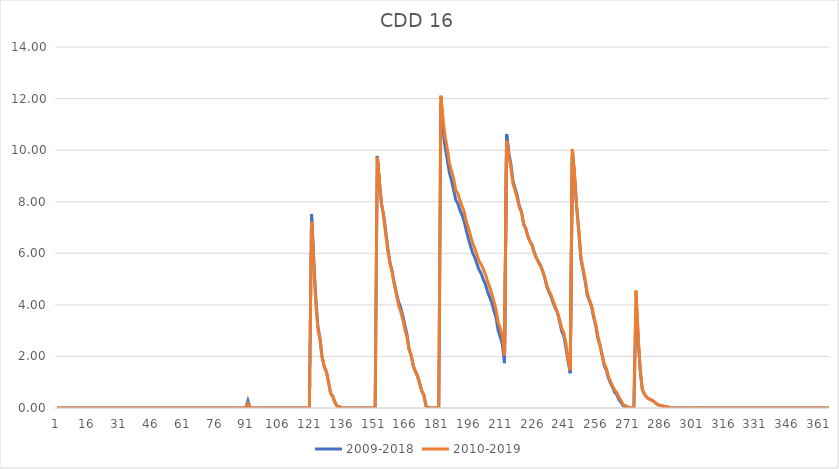
| Category | 2009-2018 | 2010-2019 |
|---|---|---|
| 0 | 0 | 0 |
| 1 | 0 | 0 |
| 2 | 0 | 0 |
| 3 | 0 | 0 |
| 4 | 0 | 0 |
| 5 | 0 | 0 |
| 6 | 0 | 0 |
| 7 | 0 | 0 |
| 8 | 0 | 0 |
| 9 | 0 | 0 |
| 10 | 0 | 0 |
| 11 | 0 | 0 |
| 12 | 0 | 0 |
| 13 | 0 | 0 |
| 14 | 0 | 0 |
| 15 | 0 | 0 |
| 16 | 0 | 0 |
| 17 | 0 | 0 |
| 18 | 0 | 0 |
| 19 | 0 | 0 |
| 20 | 0 | 0 |
| 21 | 0 | 0 |
| 22 | 0 | 0 |
| 23 | 0 | 0 |
| 24 | 0 | 0 |
| 25 | 0 | 0 |
| 26 | 0 | 0 |
| 27 | 0 | 0 |
| 28 | 0 | 0 |
| 29 | 0 | 0 |
| 30 | 0 | 0 |
| 31 | 0 | 0 |
| 32 | 0 | 0 |
| 33 | 0 | 0 |
| 34 | 0 | 0 |
| 35 | 0 | 0 |
| 36 | 0 | 0 |
| 37 | 0 | 0 |
| 38 | 0 | 0 |
| 39 | 0 | 0 |
| 40 | 0 | 0 |
| 41 | 0 | 0 |
| 42 | 0 | 0 |
| 43 | 0 | 0 |
| 44 | 0 | 0 |
| 45 | 0 | 0 |
| 46 | 0 | 0 |
| 47 | 0 | 0 |
| 48 | 0 | 0 |
| 49 | 0 | 0 |
| 50 | 0 | 0 |
| 51 | 0 | 0 |
| 52 | 0 | 0 |
| 53 | 0 | 0 |
| 54 | 0 | 0 |
| 55 | 0 | 0 |
| 56 | 0 | 0 |
| 57 | 0 | 0 |
| 58 | 0 | 0 |
| 59 | 0 | 0 |
| 60 | 0 | 0 |
| 61 | 0 | 0 |
| 62 | 0 | 0 |
| 63 | 0 | 0 |
| 64 | 0 | 0 |
| 65 | 0 | 0 |
| 66 | 0 | 0 |
| 67 | 0 | 0 |
| 68 | 0 | 0 |
| 69 | 0 | 0 |
| 70 | 0 | 0 |
| 71 | 0 | 0 |
| 72 | 0 | 0 |
| 73 | 0 | 0 |
| 74 | 0 | 0 |
| 75 | 0 | 0 |
| 76 | 0 | 0 |
| 77 | 0 | 0 |
| 78 | 0 | 0 |
| 79 | 0 | 0 |
| 80 | 0 | 0 |
| 81 | 0 | 0 |
| 82 | 0 | 0 |
| 83 | 0 | 0 |
| 84 | 0 | 0 |
| 85 | 0 | 0 |
| 86 | 0 | 0 |
| 87 | 0 | 0 |
| 88 | 0 | 0 |
| 89 | 0 | 0 |
| 90 | 0.28 | 0.17 |
| 91 | 0 | 0 |
| 92 | 0 | 0 |
| 93 | 0 | 0 |
| 94 | 0 | 0 |
| 95 | 0 | 0 |
| 96 | 0 | 0 |
| 97 | 0 | 0 |
| 98 | 0 | 0 |
| 99 | 0 | 0 |
| 100 | 0 | 0 |
| 101 | 0 | 0 |
| 102 | 0 | 0 |
| 103 | 0 | 0 |
| 104 | 0 | 0 |
| 105 | 0 | 0 |
| 106 | 0 | 0 |
| 107 | 0 | 0 |
| 108 | 0 | 0 |
| 109 | 0 | 0 |
| 110 | 0 | 0 |
| 111 | 0 | 0 |
| 112 | 0 | 0 |
| 113 | 0 | 0 |
| 114 | 0 | 0 |
| 115 | 0 | 0 |
| 116 | 0 | 0 |
| 117 | 0 | 0 |
| 118 | 0 | 0 |
| 119 | 0 | 0 |
| 120 | 7.51 | 7.22 |
| 121 | 5.83 | 5.63 |
| 122 | 4.29 | 4.1 |
| 123 | 3.17 | 3.07 |
| 124 | 2.69 | 2.66 |
| 125 | 1.96 | 1.96 |
| 126 | 1.61 | 1.61 |
| 127 | 1.41 | 1.41 |
| 128 | 1.02 | 1.02 |
| 129 | 0.58 | 0.58 |
| 130 | 0.45 | 0.45 |
| 131 | 0.23 | 0.23 |
| 132 | 0.08 | 0.08 |
| 133 | 0.06 | 0.06 |
| 134 | 0 | 0 |
| 135 | 0 | 0 |
| 136 | 0 | 0 |
| 137 | 0 | 0 |
| 138 | 0 | 0 |
| 139 | 0 | 0 |
| 140 | 0 | 0 |
| 141 | 0 | 0 |
| 142 | 0 | 0 |
| 143 | 0 | 0 |
| 144 | 0 | 0 |
| 145 | 0 | 0 |
| 146 | 0 | 0 |
| 147 | 0 | 0 |
| 148 | 0 | 0 |
| 149 | 0 | 0 |
| 150 | 0 | 0 |
| 151 | 9.77 | 9.73 |
| 152 | 8.76 | 8.8 |
| 153 | 7.9 | 7.94 |
| 154 | 7.48 | 7.43 |
| 155 | 6.86 | 6.73 |
| 156 | 6.19 | 6.08 |
| 157 | 5.63 | 5.61 |
| 158 | 5.32 | 5.27 |
| 159 | 4.86 | 4.78 |
| 160 | 4.5 | 4.42 |
| 161 | 4.13 | 3.98 |
| 162 | 3.91 | 3.76 |
| 163 | 3.58 | 3.44 |
| 164 | 3.21 | 3.06 |
| 165 | 2.87 | 2.74 |
| 166 | 2.27 | 2.27 |
| 167 | 2.04 | 2.06 |
| 168 | 1.63 | 1.64 |
| 169 | 1.41 | 1.42 |
| 170 | 1.24 | 1.24 |
| 171 | 0.95 | 0.95 |
| 172 | 0.65 | 0.65 |
| 173 | 0.49 | 0.49 |
| 174 | 0.08 | 0.08 |
| 175 | 0.01 | 0.01 |
| 176 | 0 | 0 |
| 177 | 0 | 0 |
| 178 | 0 | 0 |
| 179 | 0 | 0 |
| 180 | 0 | 0 |
| 181 | 11.82 | 12.11 |
| 182 | 10.8 | 11.17 |
| 183 | 10.09 | 10.53 |
| 184 | 9.66 | 10.07 |
| 185 | 9.13 | 9.52 |
| 186 | 8.82 | 9.19 |
| 187 | 8.47 | 8.9 |
| 188 | 8.07 | 8.45 |
| 189 | 7.93 | 8.32 |
| 190 | 7.67 | 8.06 |
| 191 | 7.48 | 7.82 |
| 192 | 7.23 | 7.6 |
| 193 | 6.88 | 7.22 |
| 194 | 6.56 | 6.98 |
| 195 | 6.27 | 6.67 |
| 196 | 6.01 | 6.38 |
| 197 | 5.83 | 6.19 |
| 198 | 5.59 | 5.94 |
| 199 | 5.36 | 5.7 |
| 200 | 5.22 | 5.57 |
| 201 | 4.99 | 5.39 |
| 202 | 4.8 | 5.2 |
| 203 | 4.52 | 4.92 |
| 204 | 4.3 | 4.7 |
| 205 | 4.08 | 4.43 |
| 206 | 3.78 | 4.14 |
| 207 | 3.52 | 3.82 |
| 208 | 3.01 | 3.34 |
| 209 | 2.75 | 3.08 |
| 210 | 2.48 | 2.83 |
| 211 | 1.74 | 2.04 |
| 212 | 10.62 | 10.36 |
| 213 | 9.9 | 9.77 |
| 214 | 9.48 | 9.33 |
| 215 | 8.81 | 8.69 |
| 216 | 8.52 | 8.43 |
| 217 | 8.24 | 8.14 |
| 218 | 7.83 | 7.77 |
| 219 | 7.62 | 7.61 |
| 220 | 7.12 | 7.17 |
| 221 | 6.98 | 6.93 |
| 222 | 6.67 | 6.66 |
| 223 | 6.46 | 6.47 |
| 224 | 6.33 | 6.3 |
| 225 | 6.04 | 6.01 |
| 226 | 5.83 | 5.82 |
| 227 | 5.68 | 5.65 |
| 228 | 5.53 | 5.5 |
| 229 | 5.32 | 5.29 |
| 230 | 5.04 | 5.08 |
| 231 | 4.69 | 4.75 |
| 232 | 4.49 | 4.54 |
| 233 | 4.31 | 4.38 |
| 234 | 4.07 | 4.14 |
| 235 | 3.86 | 3.92 |
| 236 | 3.69 | 3.71 |
| 237 | 3.35 | 3.4 |
| 238 | 2.97 | 3.09 |
| 239 | 2.79 | 2.91 |
| 240 | 2.33 | 2.49 |
| 241 | 1.81 | 1.87 |
| 242 | 1.35 | 1.46 |
| 243 | 9.77 | 10.04 |
| 244 | 9.06 | 9.08 |
| 245 | 7.82 | 7.84 |
| 246 | 6.91 | 6.93 |
| 247 | 5.8 | 5.87 |
| 248 | 5.36 | 5.43 |
| 249 | 4.94 | 5.02 |
| 250 | 4.38 | 4.48 |
| 251 | 4.16 | 4.21 |
| 252 | 3.95 | 4 |
| 253 | 3.53 | 3.61 |
| 254 | 3.2 | 3.26 |
| 255 | 2.72 | 2.79 |
| 256 | 2.45 | 2.45 |
| 257 | 2.08 | 2.06 |
| 258 | 1.65 | 1.71 |
| 259 | 1.47 | 1.55 |
| 260 | 1.16 | 1.21 |
| 261 | 0.97 | 1.03 |
| 262 | 0.81 | 0.84 |
| 263 | 0.6 | 0.69 |
| 264 | 0.51 | 0.6 |
| 265 | 0.32 | 0.41 |
| 266 | 0.21 | 0.29 |
| 267 | 0.08 | 0.12 |
| 268 | 0.07 | 0.09 |
| 269 | 0.04 | 0.04 |
| 270 | 0 | 0 |
| 271 | 0 | 0 |
| 272 | 0 | 0 |
| 273 | 3.86 | 4.55 |
| 274 | 2.7 | 2.84 |
| 275 | 1.46 | 1.47 |
| 276 | 0.72 | 0.72 |
| 277 | 0.54 | 0.54 |
| 278 | 0.42 | 0.42 |
| 279 | 0.36 | 0.36 |
| 280 | 0.32 | 0.32 |
| 281 | 0.28 | 0.28 |
| 282 | 0.21 | 0.21 |
| 283 | 0.15 | 0.15 |
| 284 | 0.11 | 0.11 |
| 285 | 0.09 | 0.09 |
| 286 | 0.07 | 0.07 |
| 287 | 0.05 | 0.05 |
| 288 | 0.04 | 0.04 |
| 289 | 0 | 0 |
| 290 | 0 | 0 |
| 291 | 0 | 0 |
| 292 | 0 | 0 |
| 293 | 0 | 0 |
| 294 | 0 | 0 |
| 295 | 0 | 0 |
| 296 | 0 | 0 |
| 297 | 0 | 0 |
| 298 | 0 | 0 |
| 299 | 0 | 0 |
| 300 | 0 | 0 |
| 301 | 0 | 0 |
| 302 | 0 | 0 |
| 303 | 0 | 0 |
| 304 | 0.01 | 0.01 |
| 305 | 0 | 0 |
| 306 | 0 | 0 |
| 307 | 0 | 0 |
| 308 | 0 | 0 |
| 309 | 0 | 0 |
| 310 | 0 | 0 |
| 311 | 0 | 0 |
| 312 | 0 | 0 |
| 313 | 0 | 0 |
| 314 | 0 | 0 |
| 315 | 0 | 0 |
| 316 | 0 | 0 |
| 317 | 0 | 0 |
| 318 | 0 | 0 |
| 319 | 0 | 0 |
| 320 | 0 | 0 |
| 321 | 0 | 0 |
| 322 | 0 | 0 |
| 323 | 0 | 0 |
| 324 | 0 | 0 |
| 325 | 0 | 0 |
| 326 | 0 | 0 |
| 327 | 0 | 0 |
| 328 | 0 | 0 |
| 329 | 0 | 0 |
| 330 | 0 | 0 |
| 331 | 0 | 0 |
| 332 | 0 | 0 |
| 333 | 0 | 0 |
| 334 | 0 | 0 |
| 335 | 0 | 0 |
| 336 | 0 | 0 |
| 337 | 0 | 0 |
| 338 | 0 | 0 |
| 339 | 0 | 0 |
| 340 | 0 | 0 |
| 341 | 0 | 0 |
| 342 | 0 | 0 |
| 343 | 0 | 0 |
| 344 | 0 | 0 |
| 345 | 0 | 0 |
| 346 | 0 | 0 |
| 347 | 0 | 0 |
| 348 | 0 | 0 |
| 349 | 0 | 0 |
| 350 | 0 | 0 |
| 351 | 0 | 0 |
| 352 | 0 | 0 |
| 353 | 0 | 0 |
| 354 | 0 | 0 |
| 355 | 0 | 0 |
| 356 | 0 | 0 |
| 357 | 0 | 0 |
| 358 | 0 | 0 |
| 359 | 0 | 0 |
| 360 | 0 | 0 |
| 361 | 0 | 0 |
| 362 | 0 | 0 |
| 363 | 0 | 0 |
| 364 | 0 | 0 |